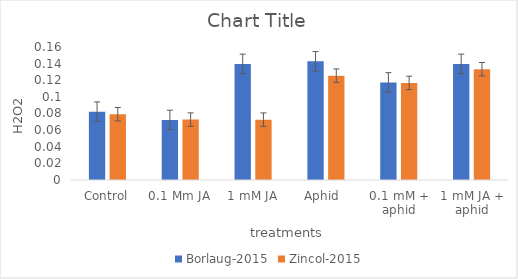
| Category | Borlaug-2015 | Zincol-2015 |
|---|---|---|
| Control | 0.082 | 0.079 |
| 0.1 Mm JA | 0.072 | 0.073 |
| 1 mM JA | 0.14 | 0.073 |
| Aphid  | 0.143 | 0.126 |
| 0.1 mM + aphid | 0.117 | 0.117 |
| 1 mM JA + aphid | 0.14 | 0.133 |